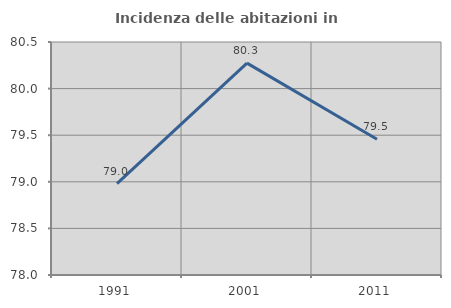
| Category | Incidenza delle abitazioni in proprietà  |
|---|---|
| 1991.0 | 78.98 |
| 2001.0 | 80.273 |
| 2011.0 | 79.456 |